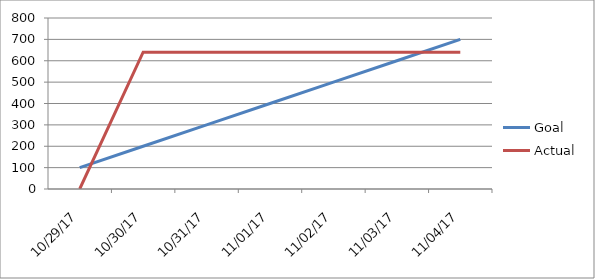
| Category | Goal | Actual |
|---|---|---|
| 2017-10-29 | 100 | 0 |
| 2017-10-30 | 200 | 640 |
| 2017-10-31 | 300 | 640 |
| 2017-11-01 | 400 | 640 |
| 2017-11-02 | 500 | 640 |
| 2017-11-03 | 600 | 640 |
| 2017-11-04 | 700 | 640 |